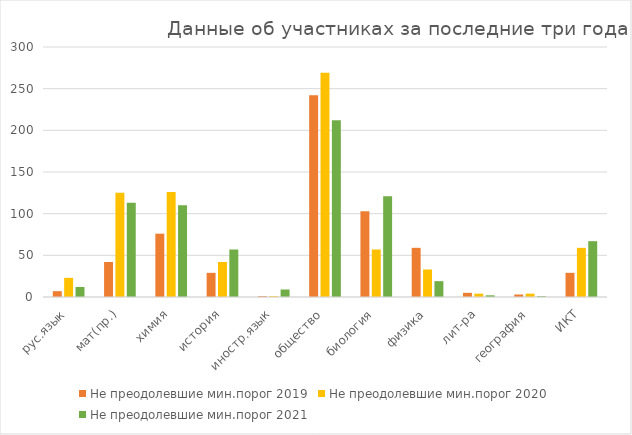
| Category | Не преодолевшие мин.порог 2019 | Не преодолевшие мин.порог 2020 | Не преодолевшие мин.порог 2021 |
|---|---|---|---|
| рус.язык | 7 | 23 | 12 |
| мат(пр.) | 42 | 125 | 113 |
| химия | 76 | 126 | 110 |
| история | 29 | 42 | 57 |
| иностр.язык | 1 | 1 | 9 |
| общество | 242 | 269 | 212 |
| биология | 103 | 57 | 121 |
| физика | 59 | 33 | 19 |
| лит-ра | 5 | 4 | 2 |
| география | 3 | 4 | 1 |
| ИКТ | 29 | 59 | 67 |